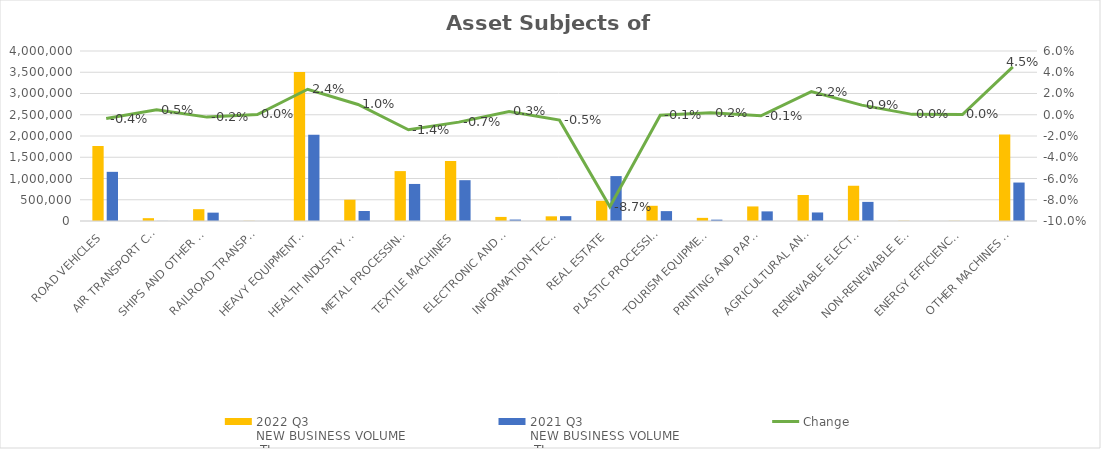
| Category | 2022 Q3 
NEW BUSINESS VOLUME
 TL | 2021 Q3 
NEW BUSINESS VOLUME
 TL |
|---|---|---|
| ROAD VEHICLES | 1765147.1 | 1156717.996 |
| AIR TRANSPORT CONVEYANCE | 66604 | 1756 |
| SHIPS AND OTHER SEA-GOING VESSELS | 277990.868 | 196661.512 |
| RAILROAD TRANSPORT VEHICLES | 3944 | 293 |
| HEAVY EQUIPMENT AND CONSTRUCTION MACHINERY | 3506913.584 | 2027623.334 |
| HEALTH INDUSTRY AND AESTHETIC INSTRUMENTS | 500740.359 | 235018.016 |
| METAL PROCESSING MACHINE | 1174083.776 | 871717.751 |
| TEXTILE MACHINES | 1411215.371 | 960440.65 |
| ELECTRONIC AND OPTICAL DEVICES | 96028.759 | 33864.124 |
| INFORMATION TECHNOLOGIES AND OFFICE SYSTEMS | 110060.118 | 114350.742 |
| REAL ESTATE | 476141 | 1056942.081 |
| PLASTIC PROCESSING MACHINES | 357907.05 | 232579.591 |
| TOURISM EQUIPMENT | 73719.217 | 31581.098 |
| PRINTING AND PAPER PROCESSING MACHINES | 342679.924 | 226526.789 |
| AGRICULTURAL AND LIVESTOCK FARMING MACHINES | 612015.652 | 200783.856 |
| RENEWABLE ELECTRICITY GENERATION | 829330.93 | 449903.632 |
| NON-RENEWABLE ELECTRIC ENERGY GENERATION | 5003.788 | 0 |
| ENERGY EFFICIENCY EQUIPMENT | 3838 | 186.993 |
| OTHER MACHINES AND EQUIPMENT | 2033147.214 | 904989.293 |